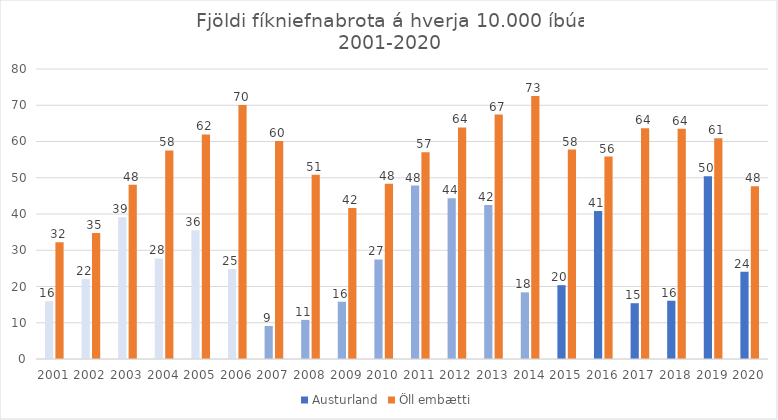
| Category | Austurland | Öll embætti |
|---|---|---|
| 2001.0 | 15.926 | 32.208 |
| 2002.0 | 22.038 | 34.725 |
| 2003.0 | 39.122 | 48.057 |
| 2004.0 | 27.752 | 57.521 |
| 2005.0 | 35.515 | 61.94 |
| 2006.0 | 24.799 | 70.073 |
| 2007.0 | 9.121 | 60.112 |
| 2008.0 | 10.791 | 50.82 |
| 2009.0 | 15.805 | 41.664 |
| 2010.0 | 27.458 | 48.327 |
| 2011.0 | 47.847 | 57.02 |
| 2012.0 | 44.373 | 63.888 |
| 2013.0 | 42.471 | 67.426 |
| 2014.0 | 18.385 | 72.544 |
| 2015.0 | 20.362 | 57.767 |
| 2016.0 | 40.795 | 55.837 |
| 2017.0 | 15.388 | 63.629 |
| 2018.0 | 16.072 | 63.506 |
| 2019.0 | 50.446 | 60.905 |
| 2020.0 | 24.086 | 47.672 |